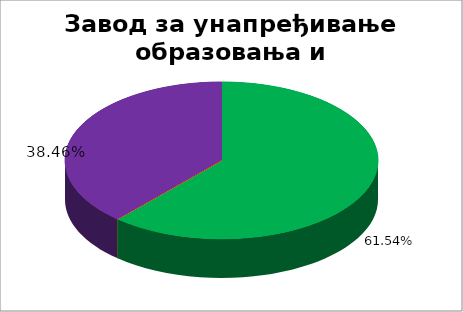
| Category | Завод за унапређивање образовања и васпитања  |
|---|---|
| 0 | 0.615 |
| 1 | 0 |
| 2 | 0 |
| 3 | 0 |
| 4 | 0.385 |